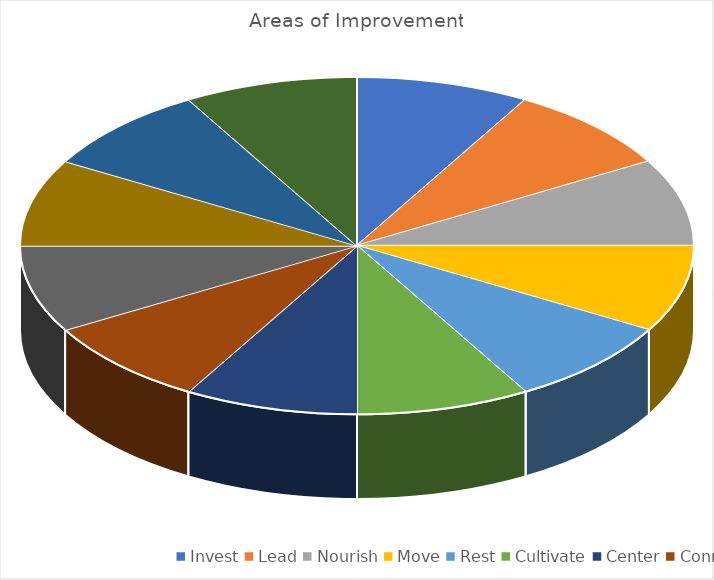
| Category | Series 0 |
|---|---|
| Invest | 12 |
| Lead | 12 |
| Nourish | 12 |
| Move | 12 |
| Rest | 12 |
| Cultivate | 12 |
| Center | 12 |
| Connect | 12 |
| Prepare | 12 |
| JEDI | 12 |
| Enjoy | 12 |
| Create  | 12 |